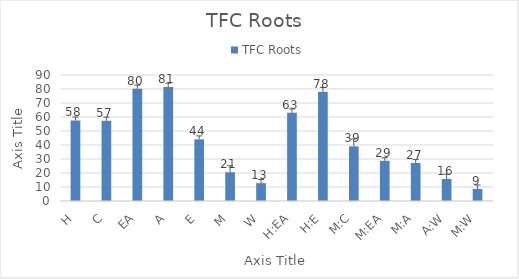
| Category | TFC Roots  |
|---|---|
| H | 57.502 |
| C | 57.276 |
| EA | 80.219 |
| A | 81.357 |
| E | 44.03 |
| M | 20.519 |
| W | 12.734 |
| H:EA | 62.959 |
| H:E | 78.122 |
| M:C | 38.998 |
| M:EA | 28.708 |
| M:A | 27.186 |
| A:W | 15.753 |
| M:W | 8.616 |